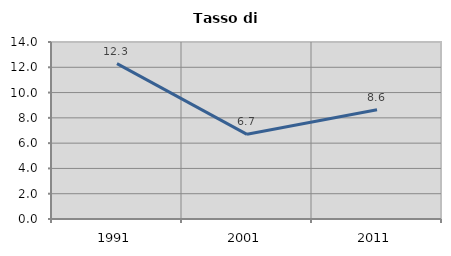
| Category | Tasso di disoccupazione   |
|---|---|
| 1991.0 | 12.287 |
| 2001.0 | 6.696 |
| 2011.0 | 8.647 |